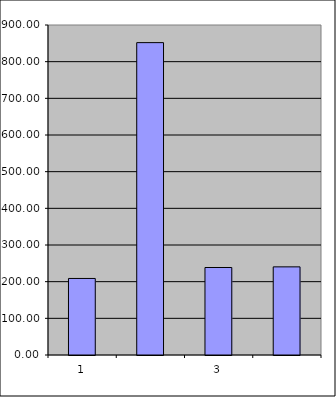
| Category | Series 0 |
|---|---|
| 0 | 208.75 |
| 1 | 851.89 |
| 2 | 238.614 |
| 3 | 240.36 |